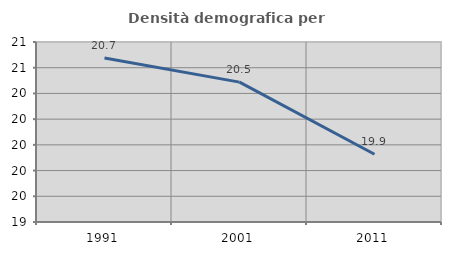
| Category | Densità demografica |
|---|---|
| 1991.0 | 20.675 |
| 2001.0 | 20.488 |
| 2011.0 | 19.927 |